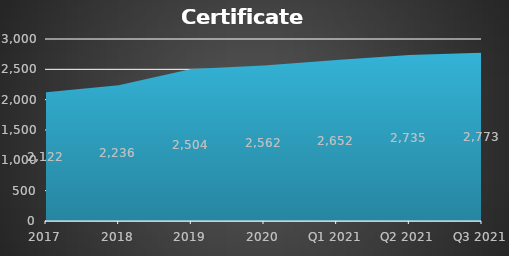
| Category | Certificate holders |
|---|---|
| 2017 | 2122 |
| 2018 | 2236 |
| 2019 | 2504 |
| 2020 | 2562 |
| Q1 2021 | 2652 |
| Q2 2021 | 2735 |
| Q3 2021 | 2773 |